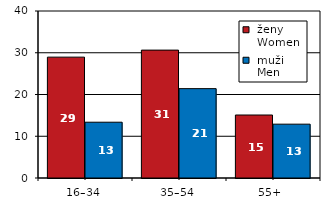
| Category |  ženy 
 Women |  muži 
 Men |
|---|---|---|
| 16–34 | 28.949 | 13.362 |
| 35–54 | 30.632 | 21.407 |
| 55+  | 15.088 | 12.894 |